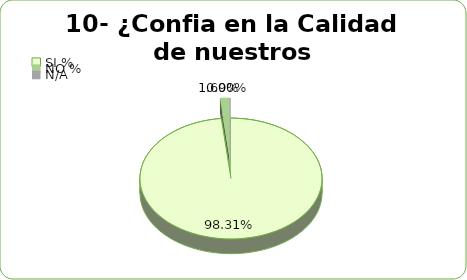
| Category | Series 0 |
|---|---|
| SI % | 0.983 |
| NO % | 0.017 |
| N/A | 0 |